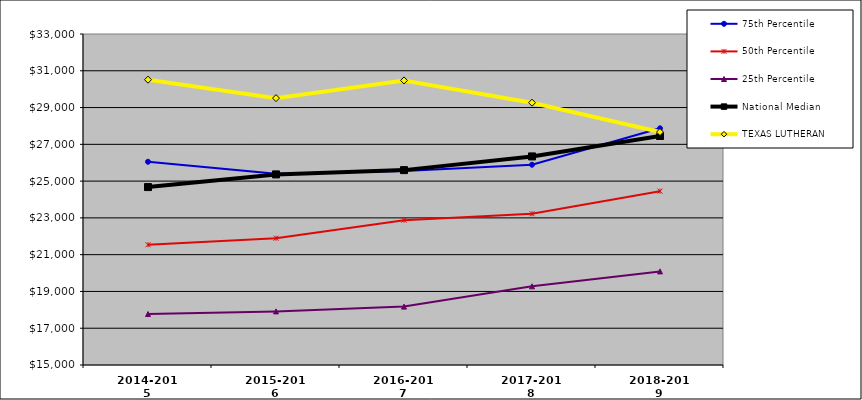
| Category | 75th Percentile | 50th Percentile | 25th Percentile | National Median | TEXAS LUTHERAN |
|---|---|---|---|---|---|
| 2014-2015 | 26051.52 | 21538.641 | 17772.426 | 24676.206 | 30515.957 |
| 2015-2016 | 25393.866 | 21894.382 | 17915.792 | 25364.205 | 29513.209 |
| 2016-2017 | 25553.59 | 22877.336 | 18175.291 | 25597.574 | 30475.146 |
| 2017-2018 | 25890 | 23225.377 | 19278.685 | 26342.841 | 29264.768 |
| 2018-2019 | 27871.313 | 24453.997 | 20090.012 | 27452.913 | 27668.054 |